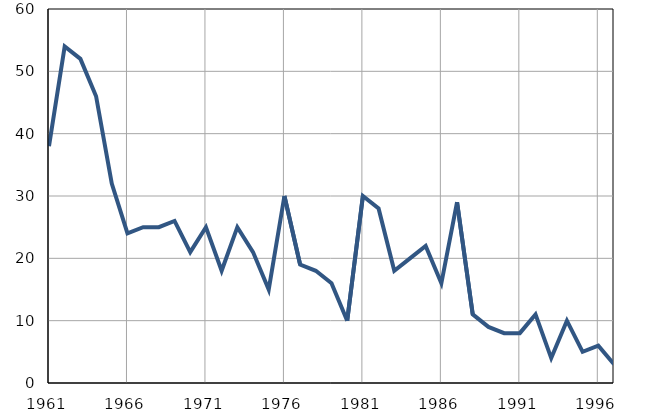
| Category | Умрла 
одојчад |
|---|---|
| 1961.0 | 38 |
| 1962.0 | 54 |
| 1963.0 | 52 |
| 1964.0 | 46 |
| 1965.0 | 32 |
| 1966.0 | 24 |
| 1967.0 | 25 |
| 1968.0 | 25 |
| 1969.0 | 26 |
| 1970.0 | 21 |
| 1971.0 | 25 |
| 1972.0 | 18 |
| 1973.0 | 25 |
| 1974.0 | 21 |
| 1975.0 | 15 |
| 1976.0 | 30 |
| 1977.0 | 19 |
| 1978.0 | 18 |
| 1979.0 | 16 |
| 1980.0 | 10 |
| 1981.0 | 30 |
| 1982.0 | 28 |
| 1983.0 | 18 |
| 1984.0 | 20 |
| 1985.0 | 22 |
| 1986.0 | 16 |
| 1987.0 | 29 |
| 1988.0 | 11 |
| 1989.0 | 9 |
| 1990.0 | 8 |
| 1991.0 | 8 |
| 1992.0 | 11 |
| 1993.0 | 4 |
| 1994.0 | 10 |
| 1995.0 | 5 |
| 1996.0 | 6 |
| 1997.0 | 3 |